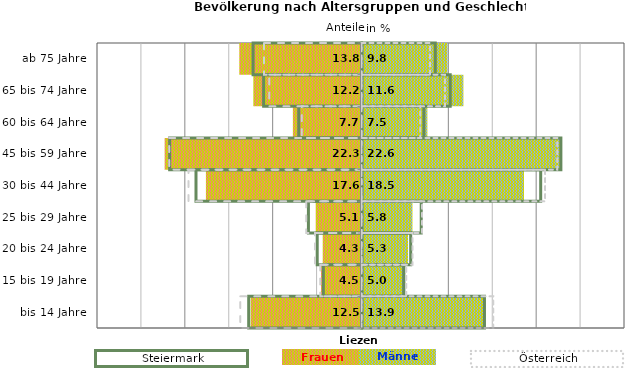
| Category | Frauen | Männer | Frauen Spalte2 | Männer Spalte2 | Frauen Spalte3 | Männer Spalte3 |
|---|---|---|---|---|---|---|
| bis 14 Jahre | -12.5 | 13.9 | 14 | -12.9 | -13.8 | 15 |
| 15 bis 19 Jahre | -4.5 | 5 | 4.8 | -4.4 | -4.7 | 5.1 |
| 20 bis 24 Jahre | -4.3 | 5.3 | 5.6 | -5.1 | -5.3 | 5.8 |
| 25 bis 29 Jahre | -5.1 | 5.8 | 6.8 | -6.1 | -6.3 | 6.9 |
| 30 bis 44 Jahre | -17.6 | 18.5 | 20.4 | -18.9 | -19.7 | 20.9 |
| 45 bis 59 Jahre | -22.3 | 22.6 | 22.7 | -21.9 | -21.9 | 22.3 |
| 60 bis 64 Jahre | -7.7 | 7.5 | 7.1 | -7.2 | -6.8 | 6.7 |
| 65 bis 74 Jahre | -12.2 | 11.6 | 10.1 | -11.2 | -10.5 | 9.5 |
| ab 75 Jahre | -13.8 | 9.8 | 8.4 | -12.4 | -11.1 | 7.8 |